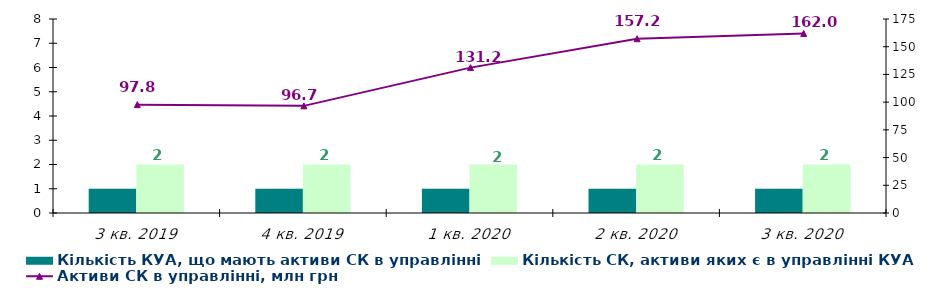
| Category | Кількість КУА, що мають активи СК в управлінні | Кількість СК, активи яких є в управлінні КУА |
|---|---|---|
| 3 кв. 2019 | 1 | 2 |
| 4 кв. 2019 | 1 | 2 |
| 1 кв. 2020 | 1 | 2 |
| 2 кв. 2020 | 1 | 2 |
| 3 кв. 2020 | 1 | 2 |